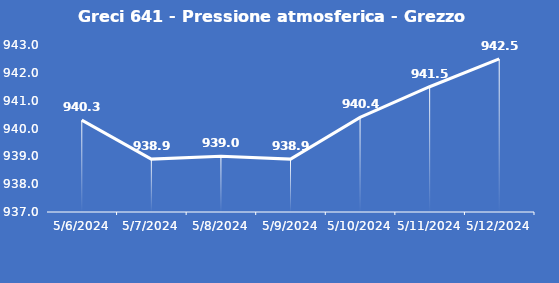
| Category | Greci 641 - Pressione atmosferica - Grezzo (hPa) |
|---|---|
| 5/6/24 | 940.3 |
| 5/7/24 | 938.9 |
| 5/8/24 | 939 |
| 5/9/24 | 938.9 |
| 5/10/24 | 940.4 |
| 5/11/24 | 941.5 |
| 5/12/24 | 942.5 |